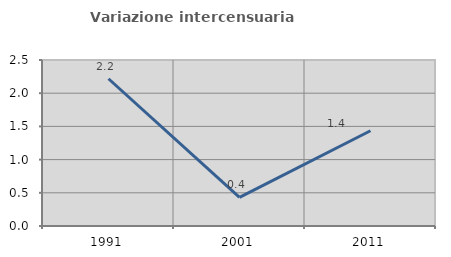
| Category | Variazione intercensuaria annua |
|---|---|
| 1991.0 | 2.218 |
| 2001.0 | 0.432 |
| 2011.0 | 1.435 |